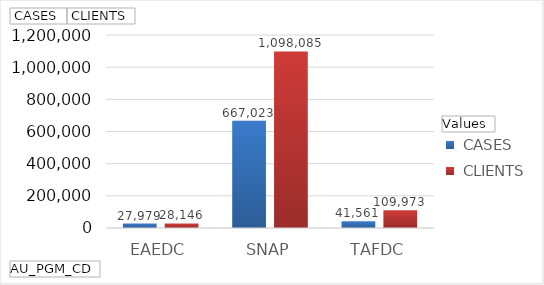
| Category |  CASES |  CLIENTS |
|---|---|---|
| EAEDC | 27979 | 28146 |
| SNAP | 667023 | 1098085 |
| TAFDC | 41561 | 109973 |